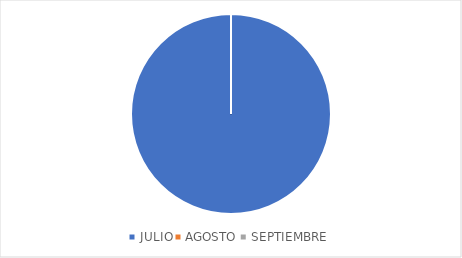
| Category | Series 0 |
|---|---|
| JULIO | 1 |
| AGOSTO | 0 |
| SEPTIEMBRE | 0 |